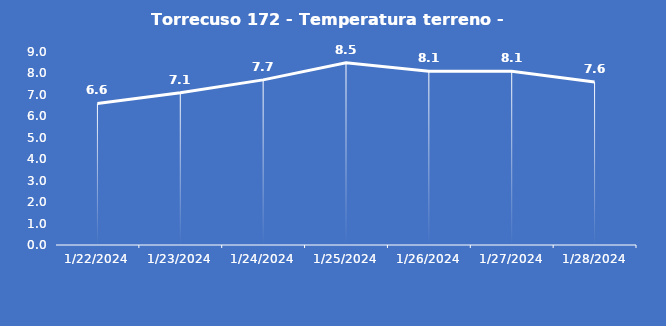
| Category | Torrecuso 172 - Temperatura terreno - Grezzo (°C) |
|---|---|
| 1/22/24 | 6.6 |
| 1/23/24 | 7.1 |
| 1/24/24 | 7.7 |
| 1/25/24 | 8.5 |
| 1/26/24 | 8.1 |
| 1/27/24 | 8.1 |
| 1/28/24 | 7.6 |